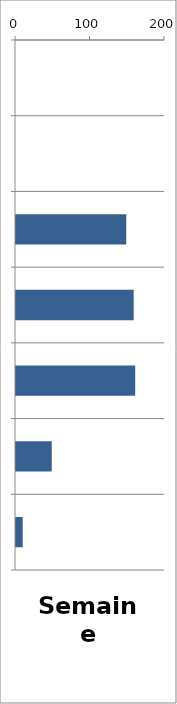
| Category | PL |
|---|---|
| 0 | 0 |
| 1 | 0 |
| 2 | 148 |
| 3 | 158 |
| 4 | 160 |
| 5 | 48 |
| 6 | 9 |